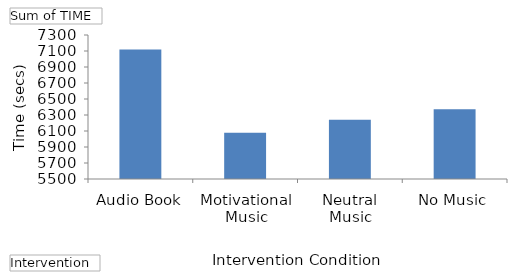
| Category | Total |
|---|---|
| Audio Book | 7118 |
| Motivational Music | 6078 |
| Neutral Music | 6240 |
| No Music | 6373 |